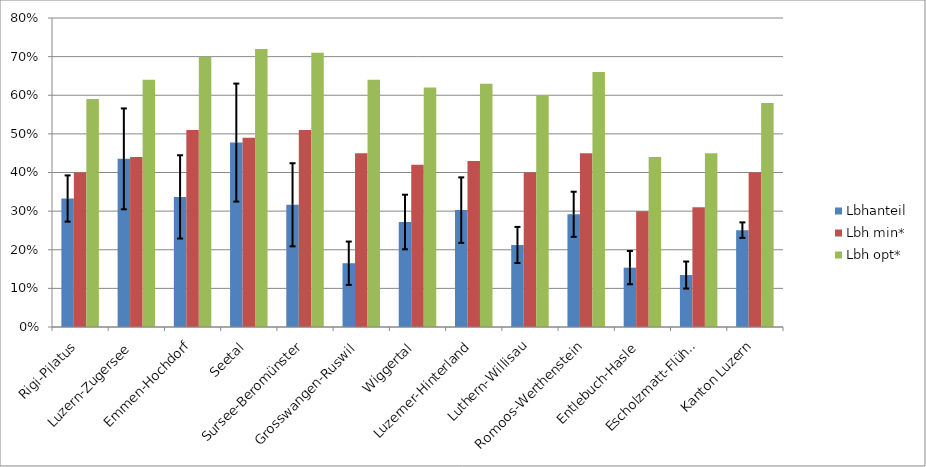
| Category | Lbhanteil | Lbh min* | Lbh opt* |
|---|---|---|---|
| Rigi-Pilatus | 0.333 | 0.4 | 0.59 |
| Luzern-Zugersee | 0.435 | 0.44 | 0.64 |
| Emmen-Hochdorf | 0.337 | 0.51 | 0.7 |
| Seetal | 0.477 | 0.49 | 0.72 |
| Sursee-Beromünster | 0.316 | 0.51 | 0.71 |
| Grosswangen-Ruswil | 0.165 | 0.45 | 0.64 |
| Wiggertal | 0.272 | 0.42 | 0.62 |
| Luzerner-Hinterland | 0.303 | 0.43 | 0.63 |
| Luthern-Willisau | 0.212 | 0.4 | 0.6 |
| Romoos-Werthenstein | 0.292 | 0.45 | 0.66 |
| Entlebuch-Hasle | 0.154 | 0.3 | 0.44 |
| Escholzmatt-Flühli | 0.135 | 0.31 | 0.45 |
| Kanton Luzern | 0.251 | 0.4 | 0.58 |